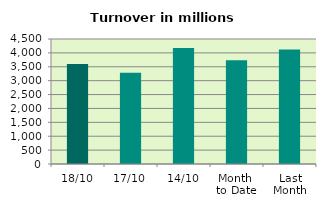
| Category | Series 0 |
|---|---|
| 18/10 | 3599.674 |
| 17/10 | 3283.227 |
| 14/10 | 4174.746 |
| Month 
to Date | 3734.172 |
| Last
Month | 4119.728 |